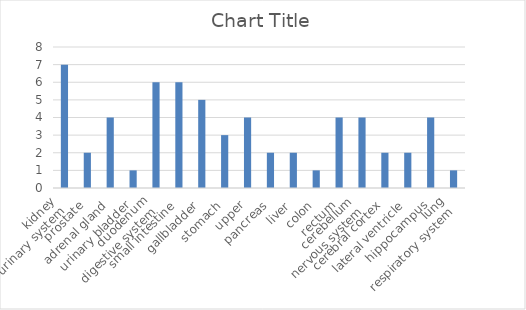
| Category | Series 0 |
|---|---|
| 0 | 7 |
| 1 | 2 |
| 2 | 4 |
| 3 | 1 |
| 4 | 6 |
| 5 | 6 |
| 6 | 5 |
| 7 | 3 |
| 8 | 4 |
| 9 | 2 |
| 10 | 2 |
| 11 | 1 |
| 12 | 4 |
| 13 | 4 |
| 14 | 2 |
| 15 | 2 |
| 16 | 4 |
| 17 | 1 |